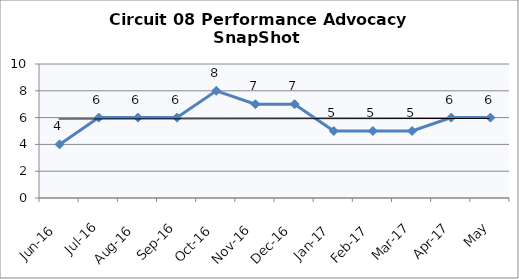
| Category | Circuit 08 |
|---|---|
| Jun-16 | 4 |
| Jul-16 | 6 |
| Aug-16 | 6 |
| Sep-16 | 6 |
| Oct-16 | 8 |
| Nov-16 | 7 |
| Dec-16 | 7 |
| Jan-17 | 5 |
| Feb-17 | 5 |
| Mar-17 | 5 |
| Apr-17 | 6 |
| May | 6 |